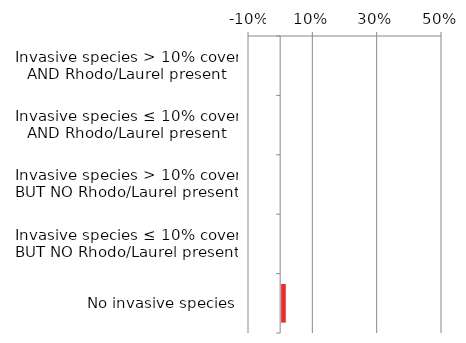
| Category | Near native & fragments |
|---|---|
| No invasive species | 0.019 |
| Invasive species ≤ 10% cover BUT NO Rhodo/Laurel present | 0.001 |
| Invasive species > 10% cover BUT NO Rhodo/Laurel present | 0 |
| Invasive species ≤ 10% cover AND Rhodo/Laurel present | 0.002 |
| Invasive species > 10% cover AND Rhodo/Laurel present | 0.001 |